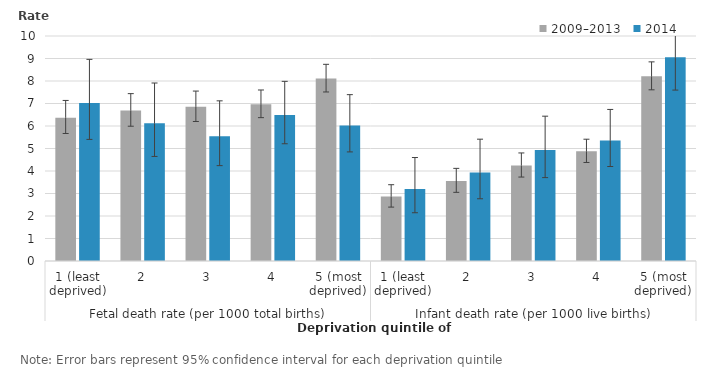
| Category | 2009–2013 | 2014 |
|---|---|---|
| 0 | 6.37 | 7.018 |
| 1 | 6.685 | 6.119 |
| 2 | 6.851 | 5.541 |
| 3 | 6.966 | 6.489 |
| 4 | 8.109 | 6.022 |
| 5 | 2.861 | 3.202 |
| 6 | 3.555 | 3.928 |
| 7 | 4.241 | 4.933 |
| 8 | 4.875 | 5.357 |
| 9 | 8.212 | 9.054 |